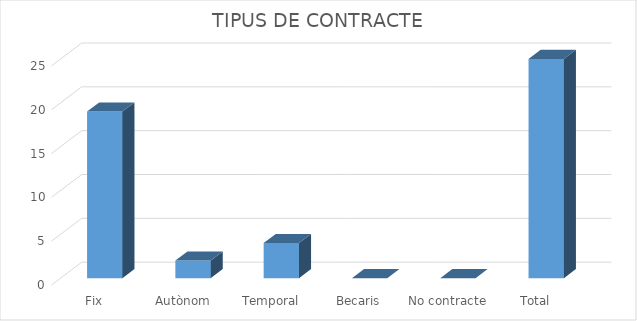
| Category | Series 0 |
|---|---|
| Fix | 19 |
| Autònom | 2 |
| Temporal | 4 |
| Becaris | 0 |
| No contracte | 0 |
| Total | 25 |